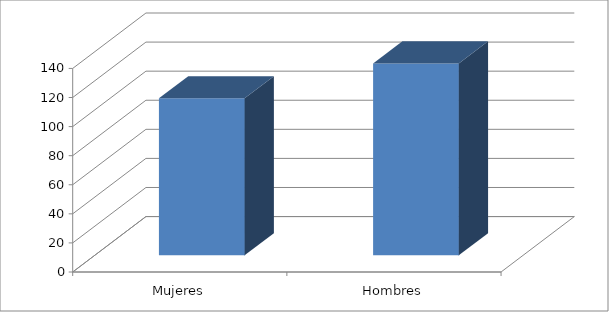
| Category | Series 0 |
|---|---|
| Mujeres | 108 |
| Hombres | 132 |